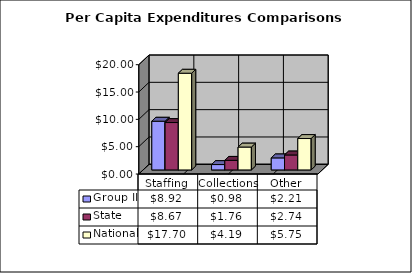
| Category | Group II | State | National |
|---|---|---|---|
| Staffing | 8.919 | 8.673 | 17.7 |
| Collections | 0.984 | 1.759 | 4.19 |
| Other | 2.207 | 2.74 | 5.75 |